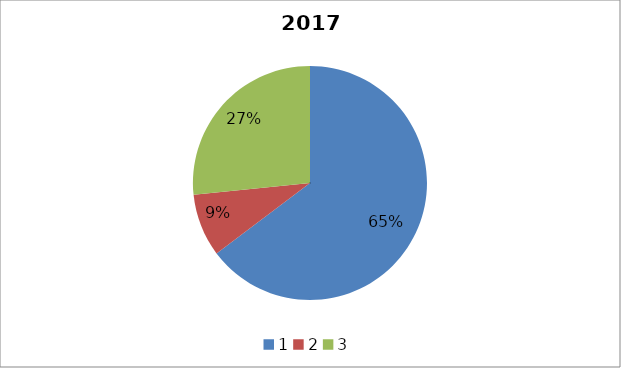
| Category | 2014 Breakdown |
|---|---|
| 0 | 0.647 |
| 1 | 0.087 |
| 2 | 0.266 |